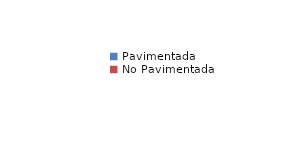
| Category | RV Vecinal |
|---|---|
| Pavimentada | 404.431 |
| No Pavimentada | 26559.371 |